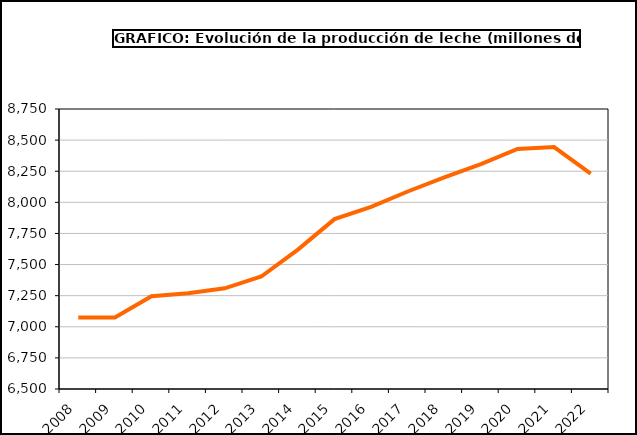
| Category | Series 0 |
|---|---|
| 2008.0 | 7075 |
| 2009.0 | 7074 |
| 2010.0 | 7245 |
| 2011.0 | 7270 |
| 2012.0 | 7309 |
| 2013.0 | 7404 |
| 2014.0 | 7620 |
| 2015.0 | 7865 |
| 2016.0 | 7963 |
| 2017.0 | 8087 |
| 2018.0 | 8200 |
| 2019.0 | 8307 |
| 2020.0 | 8429 |
| 2021.0 | 8444 |
| 2022.0 | 8231.383 |